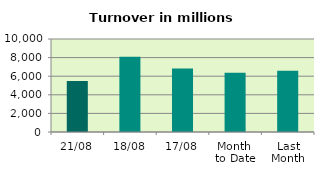
| Category | Series 0 |
|---|---|
| 21/08 | 5478.216 |
| 18/08 | 8089.124 |
| 17/08 | 6820.455 |
| Month 
to Date | 6359.831 |
| Last
Month | 6596.254 |